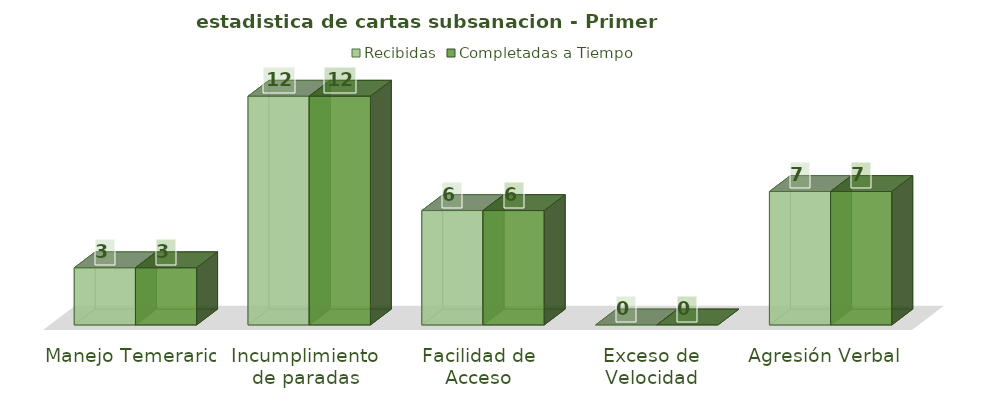
| Category | Recibidas | Completadas a Tiempo |
|---|---|---|
| Manejo Temerario | 3 | 3 |
| Incumplimiento de paradas | 12 | 12 |
| Facilidad de Acceso | 6 | 6 |
| Exceso de Velocidad | 0 | 0 |
| Agresión Verbal | 7 | 7 |